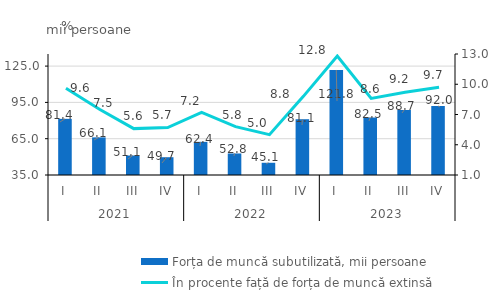
| Category | Forța de muncă subutilizată, mii persoane |
|---|---|
| 0 | 81.4 |
| 1 | 66.1 |
| 2 | 51.1 |
| 3 | 49.7 |
| 4 | 62.4 |
| 5 | 52.8 |
| 6 | 45.1 |
| 7 | 81.1 |
| 8 | 121.8 |
| 9 | 82.5 |
| 10 | 88.7 |
| 11 | 92 |